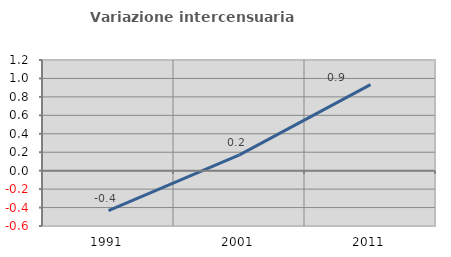
| Category | Variazione intercensuaria annua |
|---|---|
| 1991.0 | -0.433 |
| 2001.0 | 0.171 |
| 2011.0 | 0.933 |